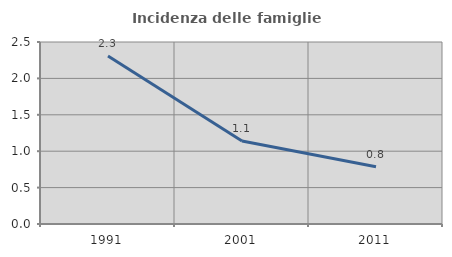
| Category | Incidenza delle famiglie numerose |
|---|---|
| 1991.0 | 2.308 |
| 2001.0 | 1.141 |
| 2011.0 | 0.787 |